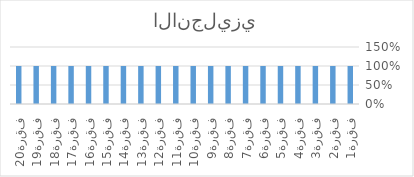
| Category | نسبة الفاقد |
|---|---|
| فقرة1 | 1 |
| فقرة2 | 1 |
| فقرة3 | 1 |
| فقرة4 | 1 |
| فقرة5 | 1 |
| فقرة6 | 1 |
| فقرة7 | 1 |
| فقرة8 | 1 |
| فقرة9 | 1 |
| فقرة10 | 1 |
| فقرة11 | 1 |
| فقرة12 | 1 |
| فقرة13 | 1 |
| فقرة14 | 1 |
| فقرة15 | 1 |
| فقرة16 | 1 |
| فقرة17 | 1 |
| فقرة18 | 1 |
| فقرة19 | 1 |
| فقرة20 | 1 |